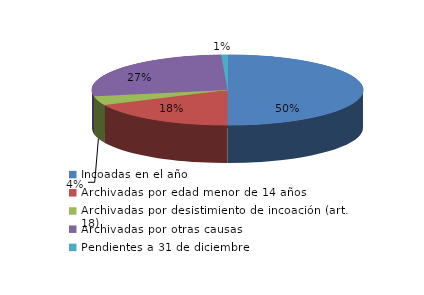
| Category | Series 0 |
|---|---|
| Incoadas en el año | 742 |
| Archivadas por edad menor de 14 años | 267 |
| Archivadas por desistimiento de incoación (art. 18) | 62 |
| Archivadas por otras causas | 402 |
| Pendientes a 31 de diciembre | 11 |